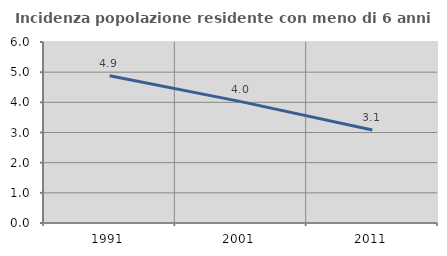
| Category | Incidenza popolazione residente con meno di 6 anni |
|---|---|
| 1991.0 | 4.878 |
| 2001.0 | 4.024 |
| 2011.0 | 3.084 |